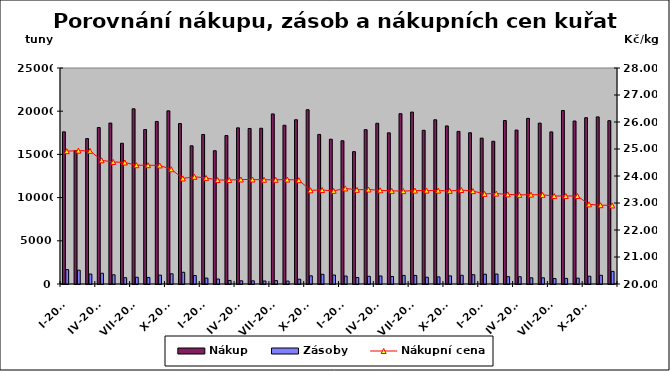
| Category | Nákup | Zásoby |
|---|---|---|
| I-2013 | 17609 | 1667 |
| II-2013 | 15430 | 1596 |
| III-2013 | 16826 | 1152 |
| IV-2013 | 18109 | 1246 |
| V-2013 | 18625 | 1065 |
| VI-2013 | 16288 | 728 |
| VII-2013 | 20278 | 776 |
| VIII-2013 | 17879 | 756 |
| IX-2013 | 18814 | 1025 |
| X-2013 | 20041 | 1182 |
| XI-2013 | 18570 | 1356 |
| XII-2013 | 15995 | 983 |
| I-2014 | 17305 | 684 |
| II-2014 | 15427 | 574 |
| III-2014 | 17182 | 412 |
| IV-2014 | 18073 | 368 |
| V-2014 | 18000 | 366 |
| VI-2014 | 18025 | 348 |
| VII-2014 | 19683 | 392 |
| VIII-2014 | 18372 | 337 |
| IX-2014 | 19012 | 552 |
| X-2014 | 20168 | 945 |
| XI-2014 | 17311 | 1122 |
| XII-2014 | 16758 | 1041 |
| I-2015 | 16579 | 921 |
| II-2015 | 15320 | 752 |
| III-2015 | 17864 | 889 |
| IV-2015 | 18604 | 928 |
| V-2015 | 17498 | 869 |
| VI-2015 | 19713 | 994 |
| VII-2015 | 19896 | 992 |
| VIII-2015 | 17788 | 782 |
| IX-2015 | 19008 | 822 |
| X-2015 | 18296 | 938 |
| XI-2015 | 17662 | 1010 |
| XII-2015 | 17505 | 1076 |
| I-2016 | 16881 | 1137 |
| II-2016 | 16521 | 1153 |
| III-2016 | 18919 | 849 |
| IV-2016 | 17817 | 841 |
| V-2016 | 19170 | 713 |
| VI-2016 | 18621 | 717 |
| VII-2016 | 17607 | 632 |
| VIII-2016 | 20078 | 648 |
| IX-2016 | 18863 | 678 |
| X-2016 | 19244 | 902 |
| XI-2016 | 19341 | 1009 |
| XII-2016 | 18901 | 1461 |